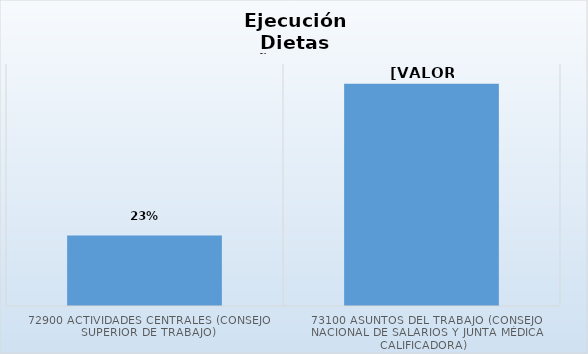
| Category | Series 0 |
|---|---|
| 72900 Actividades Centrales (Consejo Superior de Trabajo) | 0.233 |
| 73100 Asuntos del Trabajo (Consejo Nacional de Salarios y Junta Médica Calificadora) | 0.735 |